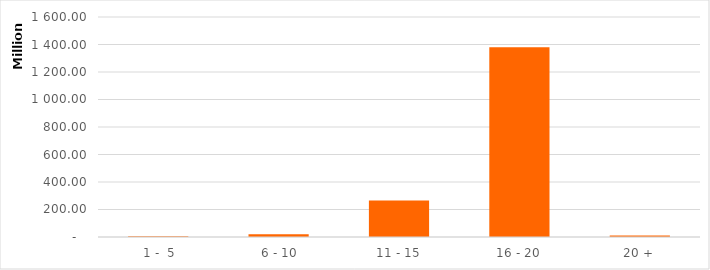
| Category | Series 0 |
|---|---|
|  1 -  5 | 4717988.42 |
|  6 - 10 | 20707412.24 |
| 11 - 15 | 265567418.2 |
| 16 - 20 | 1379738996.31 |
| 20 + | 10511581.18 |